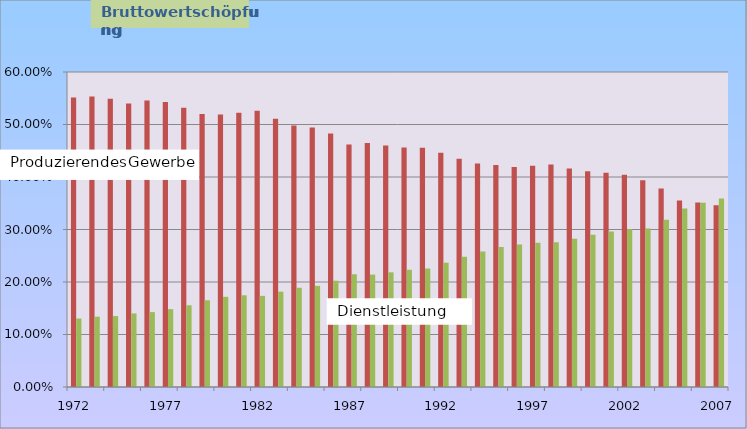
| Category | P% | D% |
|---|---|---|
| 1972.0 | 0.551 | 0.13 |
| 1973.0 | 0.553 | 0.134 |
| 1974.0 | 0.549 | 0.135 |
| 1975.0 | 0.54 | 0.14 |
| 1976.0 | 0.546 | 0.143 |
| 1977.0 | 0.543 | 0.148 |
| 1978.0 | 0.532 | 0.156 |
| 1979.0 | 0.52 | 0.165 |
| 1980.0 | 0.519 | 0.172 |
| 1981.0 | 0.522 | 0.175 |
| 1982.0 | 0.526 | 0.174 |
| 1983.0 | 0.511 | 0.182 |
| 1984.0 | 0.498 | 0.189 |
| 1985.0 | 0.494 | 0.193 |
| 1986.0 | 0.483 | 0.202 |
| 1987.0 | 0.462 | 0.215 |
| 1988.0 | 0.465 | 0.214 |
| 1989.0 | 0.46 | 0.218 |
| 1990.0 | 0.456 | 0.223 |
| 1991.0 | 0.456 | 0.226 |
| 1992.0 | 0.446 | 0.237 |
| 1993.0 | 0.435 | 0.248 |
| 1994.0 | 0.426 | 0.258 |
| 1995.0 | 0.423 | 0.266 |
| 1996.0 | 0.419 | 0.272 |
| 1997.0 | 0.421 | 0.275 |
| 1998.0 | 0.424 | 0.276 |
| 1999.0 | 0.416 | 0.283 |
| 2000.0 | 0.411 | 0.29 |
| 2001.0 | 0.408 | 0.296 |
| 2002.0 | 0.404 | 0.301 |
| 2003.0 | 0.394 | 0.302 |
| 2004.0 | 0.378 | 0.318 |
| 2005.0 | 0.355 | 0.34 |
| 2006.0 | 0.351 | 0.351 |
| 2007.0 | 0.346 | 0.359 |